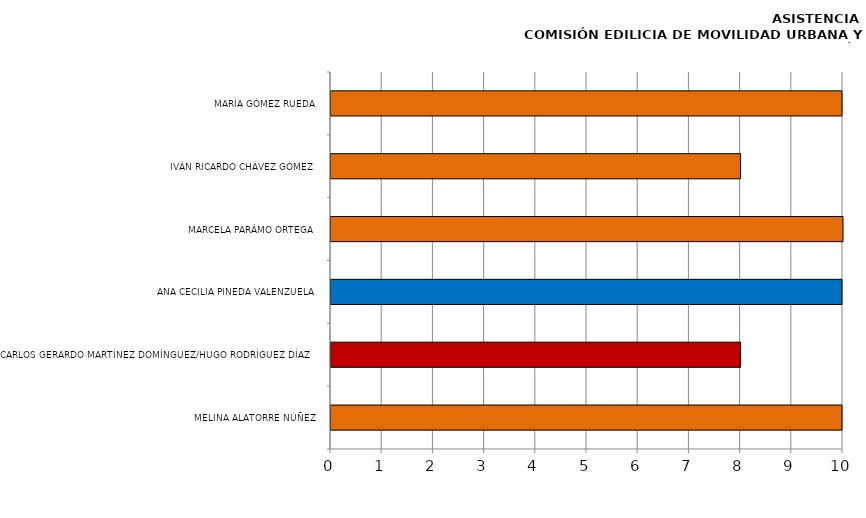
| Category | Series 0 |
|---|---|
| MELINA ALATORRE NÚÑEZ | 12 |
| CARLOS GERARDO MARTÍNEZ DOMÍNGUEZ/HUGO RODRÍGUEZ DÍAZ | 8 |
| ANA CECILIA PINEDA VALENZUELA | 12 |
| MARCELA PARÁMO ORTEGA | 10 |
| IVÁN RICARDO CHÁVEZ GÓMEZ | 8 |
| MARÍA GÓMEZ RUEDA | 11 |